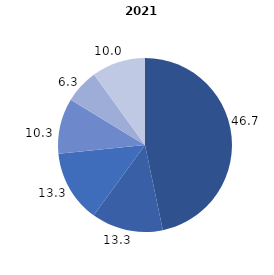
| Category | Series 0 |
|---|---|
| 0 | 46.711 |
| 1 | 13.331 |
| 2 | 13.348 |
| 3 | 10.326 |
| 4 | 6.328 |
| 5 | 9.955 |